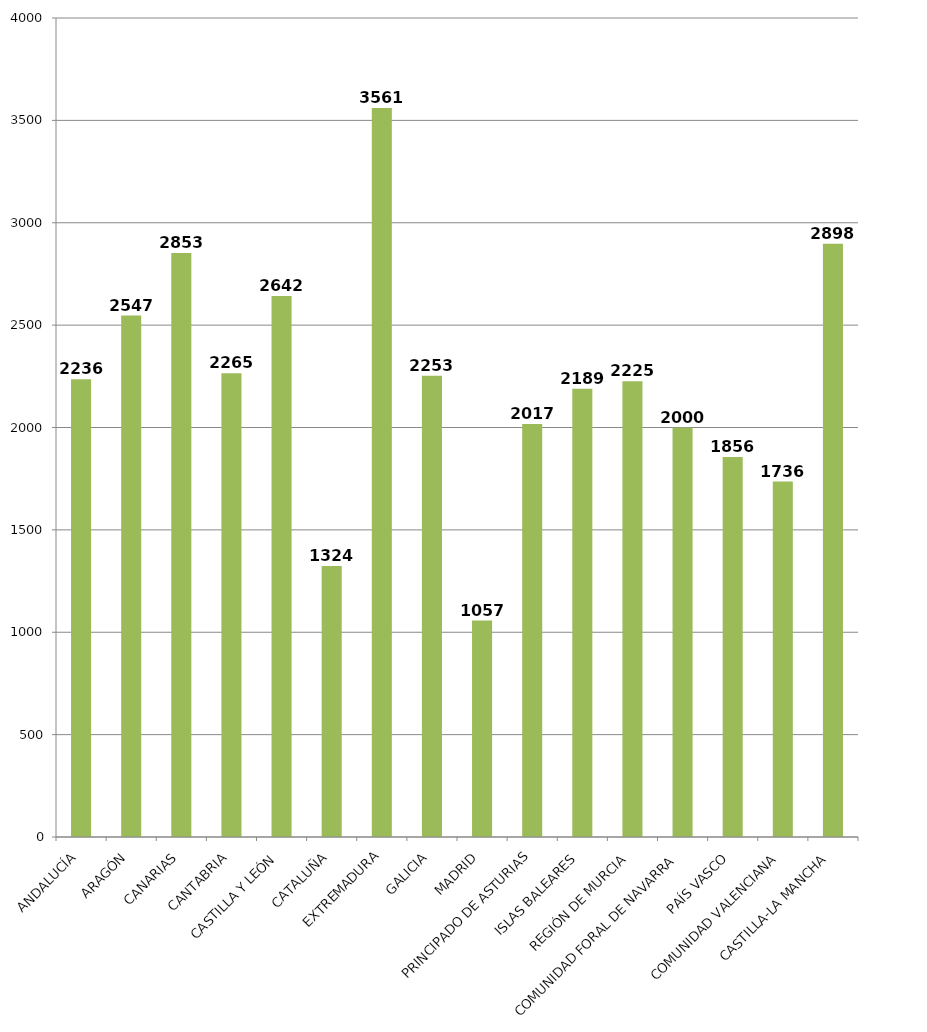
| Category | Total |
|---|---|
| ANDALUCÍA | 2235.824 |
| ARAGÓN | 2547 |
| CANARIAS | 2852.75 |
| CANTABRIA | 2264.5 |
| CASTILLA Y LEÓN | 2642.167 |
| CATALUÑA | 1323.952 |
| EXTREMADURA | 3561 |
| GALICIA | 2252.8 |
| MADRID | 1057.045 |
| PRINCIPADO DE ASTURIAS | 2017 |
| ISLAS BALEARES | 2189 |
| REGIÓN DE MURCIA | 2225.333 |
| COMUNIDAD FORAL DE NAVARRA | 1999.667 |
| PAÍS VASCO | 1856.333 |
| COMUNIDAD VALENCIANA | 1736.091 |
| CASTILLA-LA MANCHA | 2897.5 |